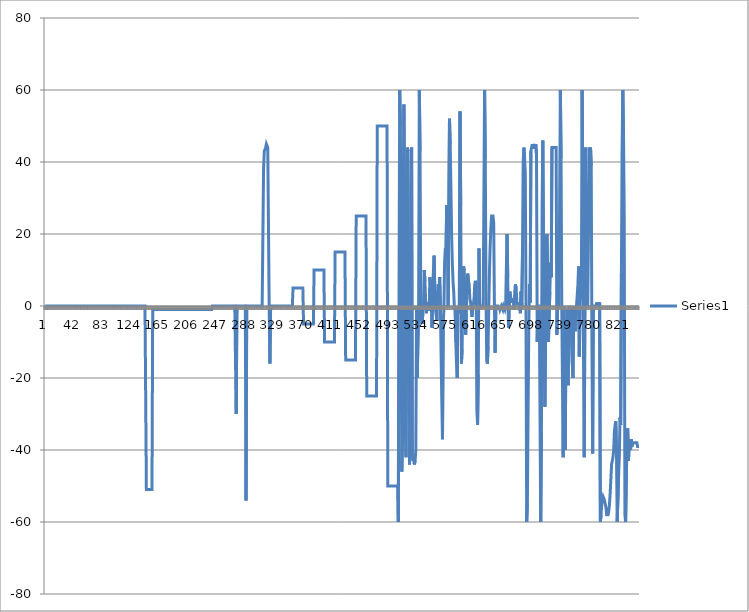
| Category | Series 0 |
|---|---|
| 0 | 0 |
| 1 | 0 |
| 2 | 0 |
| 3 | 0 |
| 4 | 0 |
| 5 | 0 |
| 6 | 0 |
| 7 | 0 |
| 8 | 0 |
| 9 | 0 |
| 10 | 0 |
| 11 | 0 |
| 12 | 0 |
| 13 | 0 |
| 14 | 0 |
| 15 | 0 |
| 16 | 0 |
| 17 | 0 |
| 18 | 0 |
| 19 | 0 |
| 20 | 0 |
| 21 | 0 |
| 22 | 0 |
| 23 | 0 |
| 24 | 0 |
| 25 | 0 |
| 26 | 0 |
| 27 | 0 |
| 28 | 0 |
| 29 | 0 |
| 30 | 0 |
| 31 | 0 |
| 32 | 0 |
| 33 | 0 |
| 34 | 0 |
| 35 | 0 |
| 36 | 0 |
| 37 | 0 |
| 38 | 0 |
| 39 | 0 |
| 40 | 0 |
| 41 | 0 |
| 42 | 0 |
| 43 | 0 |
| 44 | 0 |
| 45 | 0 |
| 46 | 0 |
| 47 | 0 |
| 48 | 0 |
| 49 | 0 |
| 50 | 0 |
| 51 | 0 |
| 52 | 0 |
| 53 | 0 |
| 54 | 0 |
| 55 | 0 |
| 56 | 0 |
| 57 | 0 |
| 58 | 0 |
| 59 | 0 |
| 60 | 0 |
| 61 | 0 |
| 62 | 0 |
| 63 | 0 |
| 64 | 0 |
| 65 | 0 |
| 66 | 0 |
| 67 | 0 |
| 68 | 0 |
| 69 | 0 |
| 70 | 0 |
| 71 | 0 |
| 72 | 0 |
| 73 | 0 |
| 74 | 0 |
| 75 | 0 |
| 76 | 0 |
| 77 | 0 |
| 78 | 0 |
| 79 | 0 |
| 80 | 0 |
| 81 | 0 |
| 82 | 0 |
| 83 | 0 |
| 84 | 0 |
| 85 | 0 |
| 86 | 0 |
| 87 | 0 |
| 88 | 0 |
| 89 | 0 |
| 90 | 0 |
| 91 | 0 |
| 92 | 0 |
| 93 | 0 |
| 94 | 0 |
| 95 | 0 |
| 96 | 0 |
| 97 | 0 |
| 98 | 0 |
| 99 | 0 |
| 100 | 0 |
| 101 | 0 |
| 102 | 0 |
| 103 | 0 |
| 104 | 0 |
| 105 | 0 |
| 106 | 0 |
| 107 | 0 |
| 108 | 0 |
| 109 | 0 |
| 110 | 0 |
| 111 | 0 |
| 112 | 0 |
| 113 | 0 |
| 114 | 0 |
| 115 | 0 |
| 116 | 0 |
| 117 | 0 |
| 118 | 0 |
| 119 | 0 |
| 120 | 0 |
| 121 | 0 |
| 122 | 0 |
| 123 | 0 |
| 124 | 0 |
| 125 | 0 |
| 126 | 0 |
| 127 | 0 |
| 128 | 0 |
| 129 | 0 |
| 130 | 0 |
| 131 | 0 |
| 132 | 0 |
| 133 | 0 |
| 134 | 0 |
| 135 | 0 |
| 136 | 0 |
| 137 | 0 |
| 138 | 0 |
| 139 | 0 |
| 140 | 0 |
| 141 | 0 |
| 142 | 0 |
| 143 | 0 |
| 144 | -51 |
| 145 | -51 |
| 146 | -51 |
| 147 | -51 |
| 148 | -51 |
| 149 | -51 |
| 150 | -51 |
| 151 | -51 |
| 152 | -51 |
| 153 | -1 |
| 154 | -1 |
| 155 | -1 |
| 156 | -1 |
| 157 | -1 |
| 158 | -1 |
| 159 | -1 |
| 160 | -1 |
| 161 | -1 |
| 162 | -1 |
| 163 | -1 |
| 164 | -1 |
| 165 | -1 |
| 166 | -1 |
| 167 | -1 |
| 168 | -1 |
| 169 | -1 |
| 170 | -1 |
| 171 | -1 |
| 172 | -1 |
| 173 | -1 |
| 174 | -1 |
| 175 | -1 |
| 176 | -1 |
| 177 | -1 |
| 178 | -1 |
| 179 | -1 |
| 180 | -1 |
| 181 | -1 |
| 182 | -1 |
| 183 | -1 |
| 184 | -1 |
| 185 | -1 |
| 186 | -1 |
| 187 | -1 |
| 188 | -1 |
| 189 | -1 |
| 190 | -1 |
| 191 | -1 |
| 192 | -1 |
| 193 | -1 |
| 194 | -1 |
| 195 | -1 |
| 196 | -1 |
| 197 | -1 |
| 198 | -1 |
| 199 | -1 |
| 200 | -1 |
| 201 | -1 |
| 202 | -1 |
| 203 | -1 |
| 204 | -1 |
| 205 | -1 |
| 206 | -1 |
| 207 | -1 |
| 208 | -1 |
| 209 | -1 |
| 210 | -1 |
| 211 | -1 |
| 212 | -1 |
| 213 | -1 |
| 214 | -1 |
| 215 | -1 |
| 216 | -1 |
| 217 | -1 |
| 218 | -1 |
| 219 | -1 |
| 220 | -1 |
| 221 | -1 |
| 222 | -1 |
| 223 | -1 |
| 224 | -1 |
| 225 | -1 |
| 226 | -1 |
| 227 | -1 |
| 228 | -1 |
| 229 | -1 |
| 230 | -1 |
| 231 | -1 |
| 232 | -1 |
| 233 | -1 |
| 234 | -1 |
| 235 | -1 |
| 236 | -1 |
| 237 | -1 |
| 238 | 0 |
| 239 | 0 |
| 240 | 0 |
| 241 | 0 |
| 242 | 0 |
| 243 | 0 |
| 244 | 0 |
| 245 | 0 |
| 246 | 0 |
| 247 | 0 |
| 248 | 0 |
| 249 | 0 |
| 250 | 0 |
| 251 | 0 |
| 252 | 0 |
| 253 | 0 |
| 254 | 0 |
| 255 | 0 |
| 256 | 0 |
| 257 | 0 |
| 258 | 0 |
| 259 | 0 |
| 260 | 0 |
| 261 | 0 |
| 262 | 0 |
| 263 | 0 |
| 264 | 0 |
| 265 | 0 |
| 266 | 0 |
| 267 | 0 |
| 268 | 0 |
| 269 | 0 |
| 270 | 0 |
| 271 | 0 |
| 272 | -30 |
| 273 | 0 |
| 274 | 0 |
| 275 | 0 |
| 276 | 0 |
| 277 | 0 |
| 278 | 0 |
| 279 | 0 |
| 280 | 0 |
| 281 | 0 |
| 282 | 0 |
| 283 | 0 |
| 284 | 0 |
| 285 | 0 |
| 286 | -54 |
| 287 | 0 |
| 288 | 0 |
| 289 | 0 |
| 290 | 0 |
| 291 | 0 |
| 292 | 0 |
| 293 | 0 |
| 294 | 0 |
| 295 | 0 |
| 296 | 0 |
| 297 | 0 |
| 298 | 0 |
| 299 | 0 |
| 300 | 0 |
| 301 | 0 |
| 302 | 0 |
| 303 | 0 |
| 304 | 0 |
| 305 | 0 |
| 306 | 0 |
| 307 | 0 |
| 308 | 0 |
| 309 | 0 |
| 310 | 0 |
| 311 | 38 |
| 312 | 43 |
| 313 | 43 |
| 314 | 44 |
| 315 | 45 |
| 316 | 45 |
| 317 | 44 |
| 318 | 44 |
| 319 | 0 |
| 320 | -16 |
| 321 | -1 |
| 322 | 0 |
| 323 | 0 |
| 324 | 0 |
| 325 | 0 |
| 326 | 0 |
| 327 | 0 |
| 328 | 0 |
| 329 | 0 |
| 330 | 0 |
| 331 | 0 |
| 332 | 0 |
| 333 | 0 |
| 334 | 0 |
| 335 | 0 |
| 336 | 0 |
| 337 | 0 |
| 338 | 0 |
| 339 | 0 |
| 340 | 0 |
| 341 | 0 |
| 342 | 0 |
| 343 | 0 |
| 344 | 0 |
| 345 | 0 |
| 346 | 0 |
| 347 | 0 |
| 348 | 0 |
| 349 | 0 |
| 350 | 0 |
| 351 | 0 |
| 352 | 0 |
| 353 | 5 |
| 354 | 5 |
| 355 | 5 |
| 356 | 5 |
| 357 | 5 |
| 358 | 5 |
| 359 | 5 |
| 360 | 5 |
| 361 | 5 |
| 362 | 5 |
| 363 | 5 |
| 364 | 5 |
| 365 | 5 |
| 366 | 5 |
| 367 | 5 |
| 368 | -5 |
| 369 | -5 |
| 370 | -5 |
| 371 | -5 |
| 372 | -5 |
| 373 | -5 |
| 374 | -5 |
| 375 | -5 |
| 376 | -5 |
| 377 | -5 |
| 378 | -5 |
| 379 | -5 |
| 380 | -5 |
| 381 | -5 |
| 382 | -5 |
| 383 | 10 |
| 384 | 10 |
| 385 | 10 |
| 386 | 10 |
| 387 | 10 |
| 388 | 10 |
| 389 | 10 |
| 390 | 10 |
| 391 | 10 |
| 392 | 10 |
| 393 | 10 |
| 394 | 10 |
| 395 | 10 |
| 396 | 10 |
| 397 | 10 |
| 398 | -10 |
| 399 | -10 |
| 400 | -10 |
| 401 | -10 |
| 402 | -10 |
| 403 | -10 |
| 404 | -10 |
| 405 | -10 |
| 406 | -10 |
| 407 | -10 |
| 408 | -10 |
| 409 | -10 |
| 410 | -10 |
| 411 | -10 |
| 412 | -10 |
| 413 | 15 |
| 414 | 15 |
| 415 | 15 |
| 416 | 15 |
| 417 | 15 |
| 418 | 15 |
| 419 | 15 |
| 420 | 15 |
| 421 | 15 |
| 422 | 15 |
| 423 | 15 |
| 424 | 15 |
| 425 | 15 |
| 426 | 15 |
| 427 | 15 |
| 428 | -15 |
| 429 | -15 |
| 430 | -15 |
| 431 | -15 |
| 432 | -15 |
| 433 | -15 |
| 434 | -15 |
| 435 | -15 |
| 436 | -15 |
| 437 | -15 |
| 438 | -15 |
| 439 | -15 |
| 440 | -15 |
| 441 | -15 |
| 442 | -15 |
| 443 | 25 |
| 444 | 25 |
| 445 | 25 |
| 446 | 25 |
| 447 | 25 |
| 448 | 25 |
| 449 | 25 |
| 450 | 25 |
| 451 | 25 |
| 452 | 25 |
| 453 | 25 |
| 454 | 25 |
| 455 | 25 |
| 456 | 25 |
| 457 | 25 |
| 458 | -25 |
| 459 | -25 |
| 460 | -25 |
| 461 | -25 |
| 462 | -25 |
| 463 | -25 |
| 464 | -25 |
| 465 | -25 |
| 466 | -25 |
| 467 | -25 |
| 468 | -25 |
| 469 | -25 |
| 470 | -25 |
| 471 | -25 |
| 472 | -25 |
| 473 | 50 |
| 474 | 50 |
| 475 | 50 |
| 476 | 50 |
| 477 | 50 |
| 478 | 50 |
| 479 | 50 |
| 480 | 50 |
| 481 | 50 |
| 482 | 50 |
| 483 | 50 |
| 484 | 50 |
| 485 | 50 |
| 486 | 50 |
| 487 | 50 |
| 488 | -50 |
| 489 | -50 |
| 490 | -50 |
| 491 | -50 |
| 492 | -50 |
| 493 | -50 |
| 494 | -50 |
| 495 | -50 |
| 496 | -50 |
| 497 | -50 |
| 498 | -50 |
| 499 | -50 |
| 500 | -50 |
| 501 | -50 |
| 502 | -50 |
| 503 | -60 |
| 504 | 0 |
| 505 | 60 |
| 506 | 50 |
| 507 | -3 |
| 508 | -46 |
| 509 | -36 |
| 510 | 26 |
| 511 | 56 |
| 512 | 26 |
| 513 | -33 |
| 514 | -42 |
| 515 | -2 |
| 516 | 44 |
| 517 | 43 |
| 518 | -11 |
| 519 | -44 |
| 520 | -19 |
| 521 | 32 |
| 522 | 44 |
| 523 | -42 |
| 524 | -43 |
| 525 | -42 |
| 526 | -44 |
| 527 | -43 |
| 528 | -40 |
| 529 | 0 |
| 530 | -20 |
| 531 | -20 |
| 532 | 0 |
| 533 | 60 |
| 534 | 43 |
| 535 | 5 |
| 536 | -4 |
| 537 | -5 |
| 538 | -2 |
| 539 | 0 |
| 540 | 10 |
| 541 | 7 |
| 542 | 1 |
| 543 | -2 |
| 544 | 1 |
| 545 | -1 |
| 546 | -1 |
| 547 | -1 |
| 548 | 8 |
| 549 | 6 |
| 550 | 5 |
| 551 | -6 |
| 552 | 5 |
| 553 | 5 |
| 554 | 14 |
| 555 | 5 |
| 556 | -1 |
| 557 | -1 |
| 558 | -4 |
| 559 | 4 |
| 560 | 6 |
| 561 | 3 |
| 562 | 8 |
| 563 | 0 |
| 564 | 0 |
| 565 | -26 |
| 566 | -37 |
| 567 | -5 |
| 568 | -1 |
| 569 | 12 |
| 570 | 16 |
| 571 | 15 |
| 572 | 28 |
| 573 | 17 |
| 574 | 0 |
| 575 | 0 |
| 576 | 52 |
| 577 | 45 |
| 578 | 33 |
| 579 | 20 |
| 580 | 12 |
| 581 | 7 |
| 582 | 4 |
| 583 | -1 |
| 584 | 0 |
| 585 | -10 |
| 586 | -16 |
| 587 | -20 |
| 588 | 0 |
| 589 | -1 |
| 590 | -2 |
| 591 | 54 |
| 592 | 28 |
| 593 | -16 |
| 594 | -12 |
| 595 | 4 |
| 596 | 11 |
| 597 | 10 |
| 598 | 1 |
| 599 | -8 |
| 600 | -2 |
| 601 | 7 |
| 602 | 9 |
| 603 | 7 |
| 604 | 6 |
| 605 | 2 |
| 606 | 1 |
| 607 | 1 |
| 608 | -3 |
| 609 | -1 |
| 610 | -1 |
| 611 | 2 |
| 612 | 6 |
| 613 | 7 |
| 614 | 6 |
| 615 | -29 |
| 616 | -33 |
| 617 | -19 |
| 618 | 16 |
| 619 | -1 |
| 620 | 0 |
| 621 | 0 |
| 622 | 0 |
| 623 | 0 |
| 624 | 0 |
| 625 | 0 |
| 626 | 60 |
| 627 | 41 |
| 628 | 4 |
| 629 | -15 |
| 630 | -16 |
| 631 | -11 |
| 632 | 0 |
| 633 | 10 |
| 634 | 17 |
| 635 | 22 |
| 636 | 25 |
| 637 | 25 |
| 638 | 25 |
| 639 | 23 |
| 640 | 0 |
| 641 | -13 |
| 642 | -1 |
| 643 | 0 |
| 644 | 0 |
| 645 | 0 |
| 646 | -1 |
| 647 | 0 |
| 648 | -1 |
| 649 | -1 |
| 650 | 0 |
| 651 | 0 |
| 652 | -1 |
| 653 | 0 |
| 654 | 0 |
| 655 | -1 |
| 656 | 0 |
| 657 | 0 |
| 658 | 20 |
| 659 | 8 |
| 660 | -6 |
| 661 | -2 |
| 662 | 4 |
| 663 | 4 |
| 664 | 1 |
| 665 | 2 |
| 666 | 1 |
| 667 | 2 |
| 668 | -1 |
| 669 | -1 |
| 670 | 6 |
| 671 | 5 |
| 672 | 1 |
| 673 | 1 |
| 674 | 0 |
| 675 | 1 |
| 676 | 0 |
| 677 | -2 |
| 678 | 4 |
| 679 | 0 |
| 680 | 14 |
| 681 | 40 |
| 682 | 44 |
| 683 | 41 |
| 684 | 37 |
| 685 | 0 |
| 686 | -60 |
| 687 | -55 |
| 688 | -29 |
| 689 | -6 |
| 690 | 6 |
| 691 | 1 |
| 692 | 43 |
| 693 | 43 |
| 694 | 45 |
| 695 | 44 |
| 696 | 44 |
| 697 | 44 |
| 698 | 44 |
| 699 | 45 |
| 700 | 42 |
| 701 | -10 |
| 702 | 0 |
| 703 | 0 |
| 704 | 0 |
| 705 | 0 |
| 706 | -60 |
| 707 | -35 |
| 708 | 28 |
| 709 | 46 |
| 710 | 17 |
| 711 | -16 |
| 712 | -28 |
| 713 | -7 |
| 714 | 19 |
| 715 | 20 |
| 716 | 7 |
| 717 | -10 |
| 718 | -10 |
| 719 | 4 |
| 720 | 12 |
| 721 | 8 |
| 722 | 44 |
| 723 | 44 |
| 724 | 44 |
| 725 | 44 |
| 726 | 44 |
| 727 | 44 |
| 728 | 44 |
| 729 | -8 |
| 730 | 0 |
| 731 | 0 |
| 732 | 0 |
| 733 | 0 |
| 734 | 60 |
| 735 | 41 |
| 736 | 0 |
| 737 | -21 |
| 738 | -42 |
| 739 | 0 |
| 740 | -18 |
| 741 | -40 |
| 742 | -5 |
| 743 | -18 |
| 744 | -1 |
| 745 | -22 |
| 746 | -1 |
| 747 | 0 |
| 748 | -1 |
| 749 | 0 |
| 750 | 0 |
| 751 | -16 |
| 752 | -20 |
| 753 | 0 |
| 754 | -4 |
| 755 | -7 |
| 756 | -6 |
| 757 | 0 |
| 758 | 0 |
| 759 | 6 |
| 760 | 11 |
| 761 | -14 |
| 762 | 0 |
| 763 | 0 |
| 764 | 7 |
| 765 | 60 |
| 766 | 20 |
| 767 | -15 |
| 768 | -42 |
| 769 | 2 |
| 770 | 44 |
| 771 | 0 |
| 772 | 0 |
| 773 | 0 |
| 774 | 19 |
| 775 | 44 |
| 776 | 43 |
| 777 | 44 |
| 778 | 39 |
| 779 | -11 |
| 780 | -41 |
| 781 | 0 |
| 782 | 0 |
| 783 | 0 |
| 784 | 0 |
| 785 | 0 |
| 786 | 1 |
| 787 | 0 |
| 788 | 1 |
| 789 | 0 |
| 790 | 1 |
| 791 | -60 |
| 792 | -58 |
| 793 | -55 |
| 794 | -54 |
| 795 | -53 |
| 796 | -53 |
| 797 | -54 |
| 798 | -55 |
| 799 | -56 |
| 800 | -58 |
| 801 | -58 |
| 802 | -58 |
| 803 | -57 |
| 804 | -55 |
| 805 | -52 |
| 806 | -48 |
| 807 | -44 |
| 808 | -43 |
| 809 | -42 |
| 810 | -40 |
| 811 | -35 |
| 812 | -33 |
| 813 | -32 |
| 814 | -41 |
| 815 | -60 |
| 816 | -60 |
| 817 | -47 |
| 818 | -42 |
| 819 | -31 |
| 820 | -33 |
| 821 | 9 |
| 822 | 44 |
| 823 | 60 |
| 824 | 48 |
| 825 | 25 |
| 826 | -58 |
| 827 | -60 |
| 828 | -60 |
| 829 | -36 |
| 830 | -34 |
| 831 | -43 |
| 832 | -39 |
| 833 | -37 |
| 834 | -40 |
| 835 | -37 |
| 836 | -39 |
| 837 | -38 |
| 838 | -38 |
| 839 | -38 |
| 840 | -38 |
| 841 | -38 |
| 842 | -38 |
| 843 | -38 |
| 844 | -39 |
| 845 | -39 |
| 846 | -39 |
| 847 | -39 |